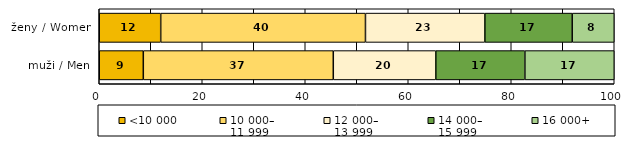
| Category | <10 000 | 10 000–
11 999 | 12 000–
13 999 | 14 000–
15 999 | 16 000+ |
|---|---|---|---|---|---|
| muži / Men | 8.555 | 36.889 | 19.907 | 17.295 | 17.354 |
| ženy / Women | 11.934 | 39.756 | 23.186 | 16.959 | 8.164 |